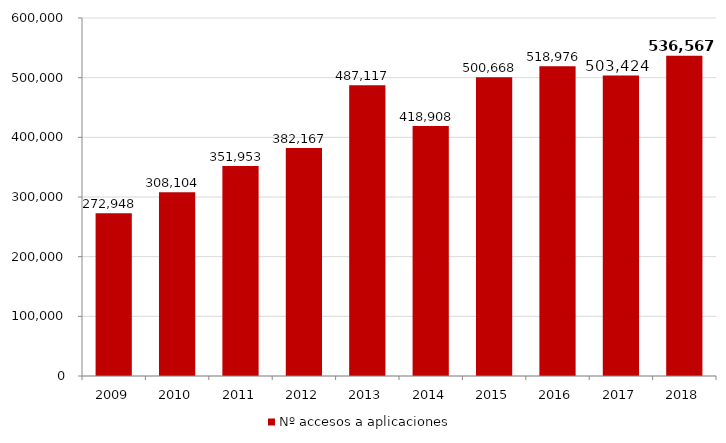
| Category | Nº accesos a aplicaciones |
|---|---|
| 2009.0 | 272948 |
| 2010.0 | 308104 |
| 2011.0 | 351953 |
| 2012.0 | 382167 |
| 2013.0 | 487117 |
| 2014.0 | 418908 |
| 2015.0 | 500668 |
| 2016.0 | 518976 |
| 2017.0 | 503424 |
| 2018.0 | 536567 |